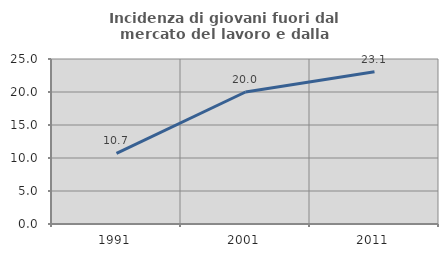
| Category | Incidenza di giovani fuori dal mercato del lavoro e dalla formazione  |
|---|---|
| 1991.0 | 10.714 |
| 2001.0 | 20 |
| 2011.0 | 23.077 |